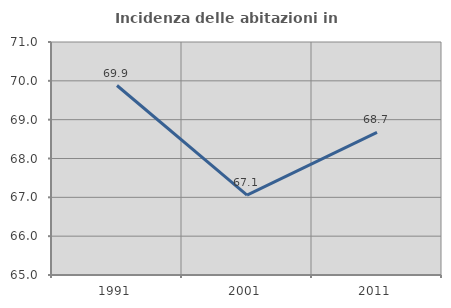
| Category | Incidenza delle abitazioni in proprietà  |
|---|---|
| 1991.0 | 69.88 |
| 2001.0 | 67.059 |
| 2011.0 | 68.675 |